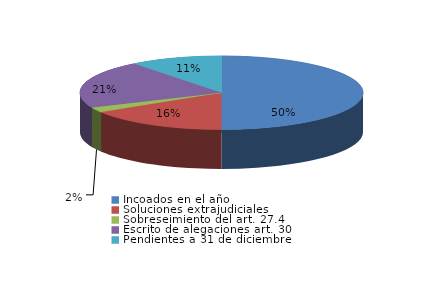
| Category | Series 0 |
|---|---|
| Incoados en el año | 251 |
| Soluciones extrajudiciales | 81 |
| Sobreseimiento del art. 27.4 | 11 |
| Escrito de alegaciones art. 30 | 106 |
| Pendientes a 31 de diciembre | 53 |